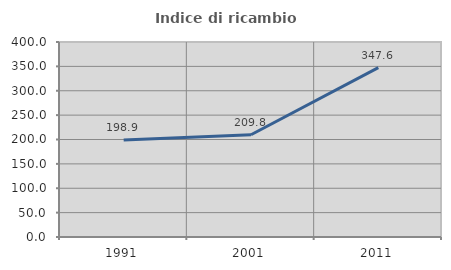
| Category | Indice di ricambio occupazionale  |
|---|---|
| 1991.0 | 198.867 |
| 2001.0 | 209.814 |
| 2011.0 | 347.564 |